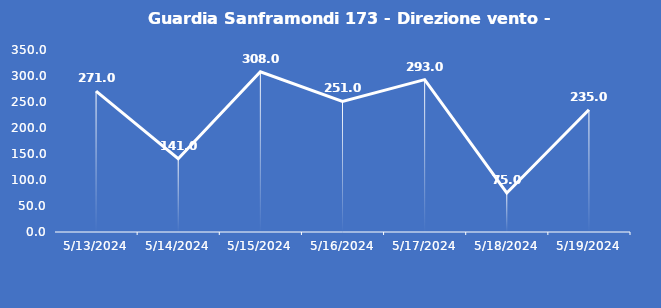
| Category | Guardia Sanframondi 173 - Direzione vento - Grezzo (°N) |
|---|---|
| 5/13/24 | 271 |
| 5/14/24 | 141 |
| 5/15/24 | 308 |
| 5/16/24 | 251 |
| 5/17/24 | 293 |
| 5/18/24 | 75 |
| 5/19/24 | 235 |